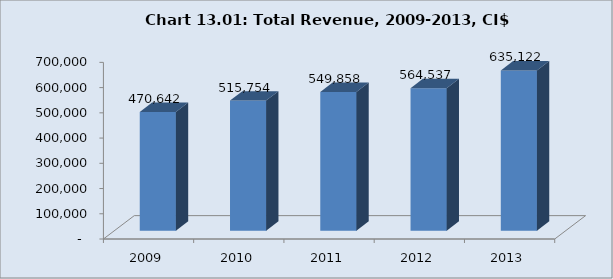
| Category | CI$ (000's) |
|---|---|
| 2009.0 | 470641.825 |
| 2010.0 | 515754 |
| 2011.0 | 549858 |
| 2012.0 | 564536.891 |
| 2013.0 | 635122.313 |